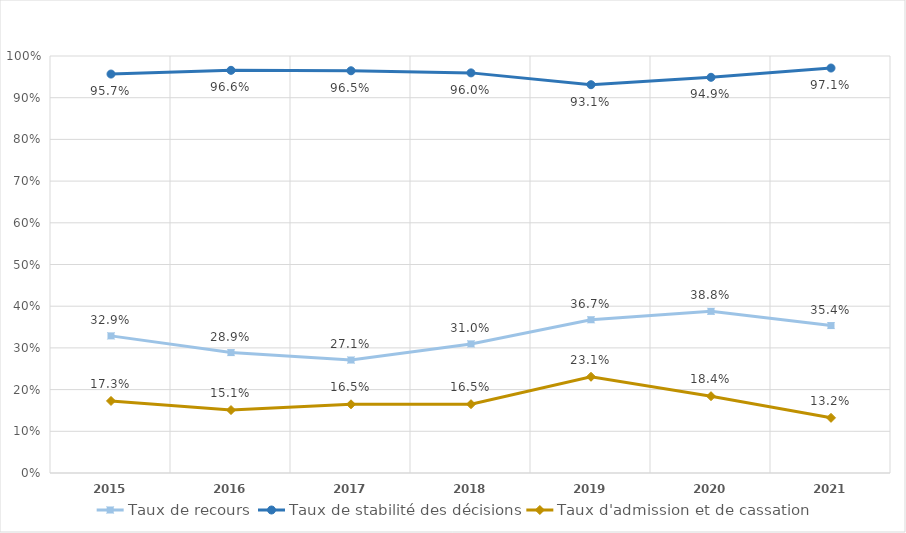
| Category | Taux de recours | Taux de stabilité des décisions | Taux d'admission et de cassation |
|---|---|---|---|
| 2015.0 | 0.329 | 0.957 | 0.173 |
| 2016.0 | 0.289 | 0.966 | 0.151 |
| 2017.0 | 0.271 | 0.965 | 0.165 |
| 2018.0 | 0.31 | 0.96 | 0.165 |
| 2019.0 | 0.367 | 0.931 | 0.231 |
| 2020.0 | 0.388 | 0.949 | 0.184 |
| 2021.0 | 0.354 | 0.971 | 0.132 |